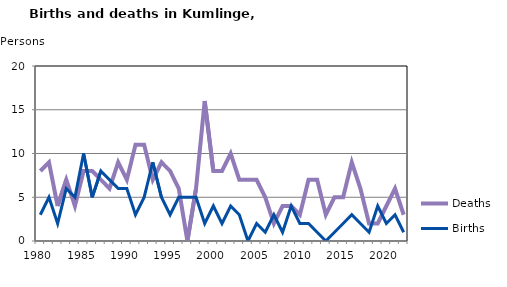
| Category | Deaths | Births |
|---|---|---|
| 1980.0 | 8 | 3 |
| 1981.0 | 9 | 5 |
| 1982.0 | 4 | 2 |
| 1983.0 | 7 | 6 |
| 1984.0 | 4 | 5 |
| 1985.0 | 8 | 10 |
| 1986.0 | 8 | 5 |
| 1987.0 | 7 | 8 |
| 1988.0 | 6 | 7 |
| 1989.0 | 9 | 6 |
| 1990.0 | 7 | 6 |
| 1991.0 | 11 | 3 |
| 1992.0 | 11 | 5 |
| 1993.0 | 7 | 9 |
| 1994.0 | 9 | 5 |
| 1995.0 | 8 | 3 |
| 1996.0 | 6 | 5 |
| 1997.0 | 0 | 5 |
| 1998.0 | 6 | 5 |
| 1999.0 | 16 | 2 |
| 2000.0 | 8 | 4 |
| 2001.0 | 8 | 2 |
| 2002.0 | 10 | 4 |
| 2003.0 | 7 | 3 |
| 2004.0 | 7 | 0 |
| 2005.0 | 7 | 2 |
| 2006.0 | 5 | 1 |
| 2007.0 | 2 | 3 |
| 2008.0 | 4 | 1 |
| 2009.0 | 4 | 4 |
| 2010.0 | 3 | 2 |
| 2011.0 | 7 | 2 |
| 2012.0 | 7 | 1 |
| 2013.0 | 3 | 0 |
| 2014.0 | 5 | 1 |
| 2015.0 | 5 | 2 |
| 2016.0 | 9 | 3 |
| 2017.0 | 6 | 2 |
| 2018.0 | 2 | 1 |
| 2019.0 | 2 | 4 |
| 2020.0 | 4 | 2 |
| 2021.0 | 6 | 3 |
| 2022.0 | 3 | 1 |